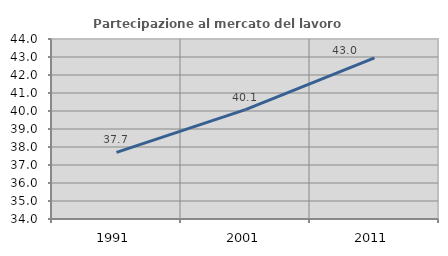
| Category | Partecipazione al mercato del lavoro  femminile |
|---|---|
| 1991.0 | 37.705 |
| 2001.0 | 40.075 |
| 2011.0 | 42.953 |